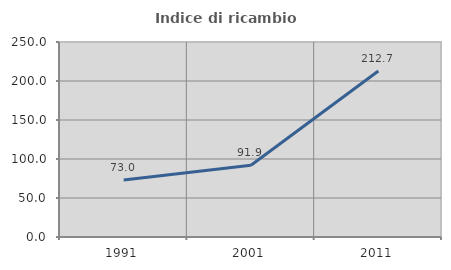
| Category | Indice di ricambio occupazionale  |
|---|---|
| 1991.0 | 73.016 |
| 2001.0 | 91.919 |
| 2011.0 | 212.727 |